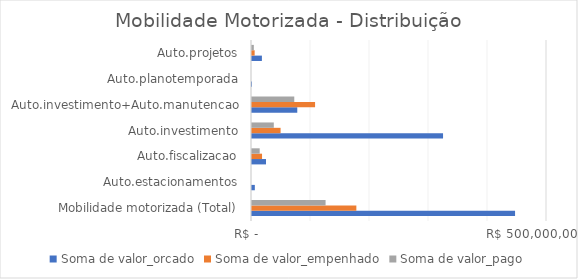
| Category | Soma de valor_orcado | Soma de valor_empenhado | Soma de valor_pago |
|---|---|---|---|
| Mobilidade motorizada (Total) | 445859974 | 176868419.9 | 124707028.19 |
| Auto.estacionamentos | 4800940 | 0 | 0 |
| Auto.fiscalizacao | 23731049 | 17024650.1 | 13033727.82 |
| Auto.investimento | 323802255 | 48453688.35 | 36944725.86 |
| Auto.investimento+Auto.manutencao | 76739543 | 106900082.34 | 71646062.55 |
| Auto.planotemporada | 1000 | 0 | 0 |
| Auto.projetos | 16785187 | 4489999.11 | 3082511.96 |